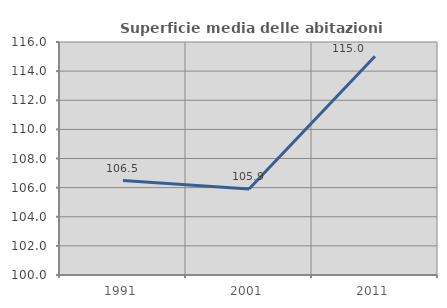
| Category | Superficie media delle abitazioni occupate |
|---|---|
| 1991.0 | 106.483 |
| 2001.0 | 105.907 |
| 2011.0 | 115.023 |